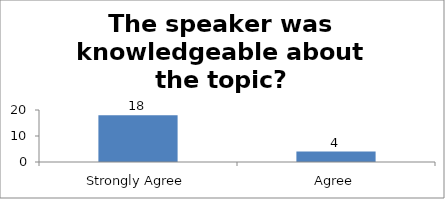
| Category | The speaker was knowledgeable about the topic? |
|---|---|
| Strongly Agree | 18 |
| Agree | 4 |